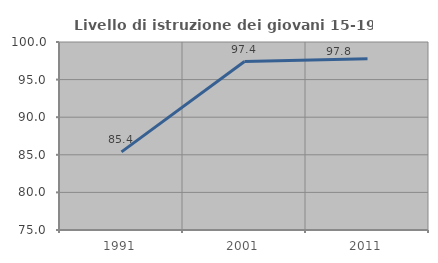
| Category | Livello di istruzione dei giovani 15-19 anni |
|---|---|
| 1991.0 | 85.393 |
| 2001.0 | 97.403 |
| 2011.0 | 97.778 |